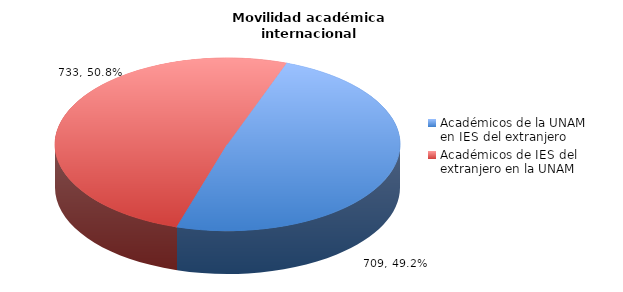
| Category | Series 0 |
|---|---|
| Académicos de la UNAM en IES del extranjero | 709 |
| Académicos de IES del extranjero en la UNAM | 733 |